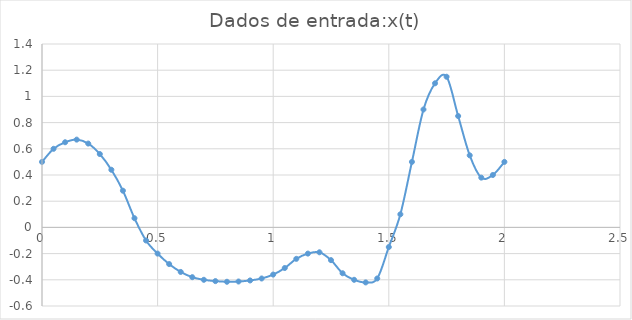
| Category | Series 0 |
|---|---|
| 0.0 | 0.5 |
| 0.05 | 0.6 |
| 0.1 | 0.65 |
| 0.15000000000000002 | 0.67 |
| 0.2 | 0.64 |
| 0.25 | 0.56 |
| 0.3 | 0.44 |
| 0.35 | 0.28 |
| 0.39999999999999997 | 0.07 |
| 0.44999999999999996 | -0.1 |
| 0.49999999999999994 | -0.2 |
| 0.5499999999999999 | -0.28 |
| 0.6 | -0.34 |
| 0.65 | -0.38 |
| 0.7000000000000001 | -0.4 |
| 0.7500000000000001 | -0.41 |
| 0.8000000000000002 | -0.415 |
| 0.8500000000000002 | -0.413 |
| 0.9000000000000002 | -0.405 |
| 0.9500000000000003 | -0.39 |
| 1.0000000000000002 | -0.36 |
| 1.0500000000000003 | -0.31 |
| 1.1000000000000003 | -0.24 |
| 1.1500000000000004 | -0.2 |
| 1.2000000000000004 | -0.19 |
| 1.2500000000000004 | -0.25 |
| 1.3000000000000005 | -0.35 |
| 1.3500000000000005 | -0.4 |
| 1.4000000000000006 | -0.42 |
| 1.4500000000000006 | -0.39 |
| 1.5000000000000007 | -0.15 |
| 1.5500000000000007 | 0.1 |
| 1.6000000000000008 | 0.5 |
| 1.6500000000000008 | 0.9 |
| 1.7000000000000008 | 1.1 |
| 1.7500000000000009 | 1.15 |
| 1.800000000000001 | 0.85 |
| 1.850000000000001 | 0.55 |
| 1.900000000000001 | 0.38 |
| 1.950000000000001 | 0.4 |
| 2.000000000000001 | 0.5 |